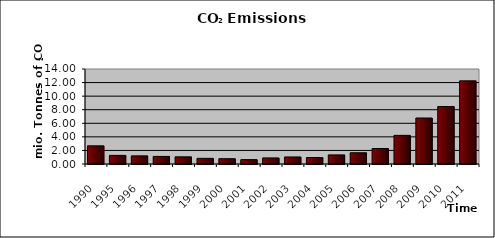
| Category | Series 0 |
|---|---|
| 1990.0 | 2.677 |
| 1995.0 | 1.269 |
| 1996.0 | 1.199 |
| 1997.0 | 1.115 |
| 1998.0 | 1.056 |
| 1999.0 | 0.832 |
| 2000.0 | 0.781 |
| 2001.0 | 0.645 |
| 2002.0 | 0.895 |
| 2003.0 | 1.038 |
| 2004.0 | 0.957 |
| 2005.0 | 1.338 |
| 2006.0 | 1.658 |
| 2007.0 | 2.281 |
| 2008.0 | 4.217 |
| 2009.0 | 6.777 |
| 2010.0 | 8.471 |
| 2011.0 | 12.251 |